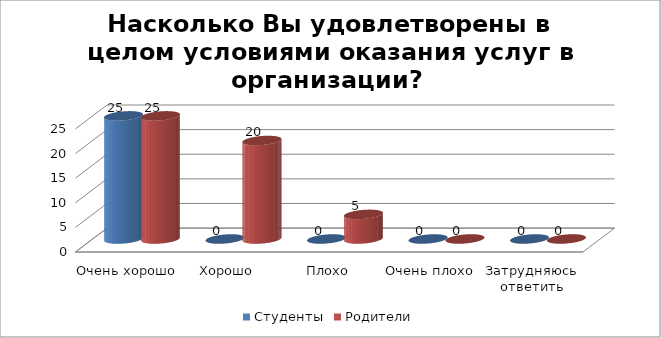
| Category | Студенты | Родители |
|---|---|---|
| Очень хорошо | 25 | 25 |
| Хорошо | 0 | 20 |
| Плохо | 0 | 5 |
| Очень плохо | 0 | 0 |
| Затрудняюсь ответить | 0 | 0 |